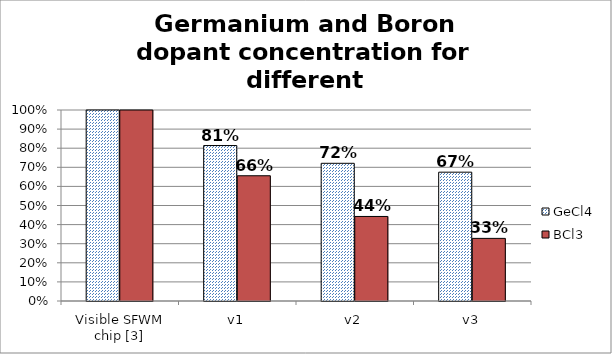
| Category | GeCl4 | BCl3 |
|---|---|---|
| Visible SFWM chip [3] | 1 | 1 |
| v1 | 0.814 | 0.656 |
| v2 | 0.721 | 0.443 |
| v3 | 0.674 | 0.328 |